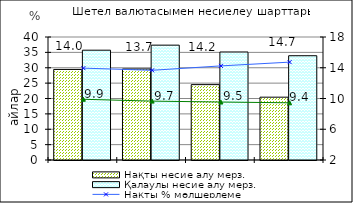
| Category | Нақты несие алу мерз.  | Қалаулы несие алу мерз. |
|---|---|---|
| 0 | 29.45 | 35.71 |
| 1 | 29.6 | 37.35 |
| 2 | 24.51 | 35.12 |
| 3 | 20.43 | 33.91 |